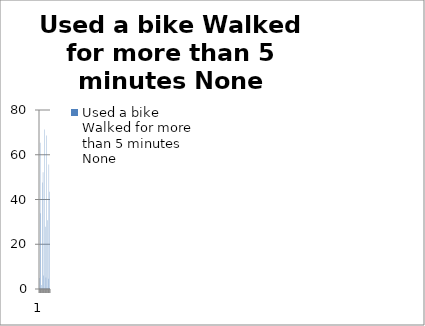
| Category | Used a bike Walked for more than 5 minutes None |
|---|---|
| 0 | 4.968 |
| 1 | 65.383 |
| 2 | 33.894 |
| 3 | 1.782 |
| 4 | 47.644 |
| 5 | 52.135 |
| 6 | 6.054 |
| 7 | 71.254 |
| 8 | 27.85 |
| 9 | 5.114 |
| 10 | 68.654 |
| 11 | 30.699 |
| 12 | 4.531 |
| 13 | 55.615 |
| 14 | 43.432 |